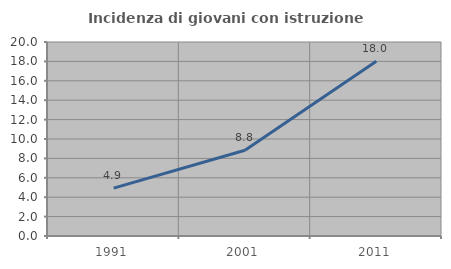
| Category | Incidenza di giovani con istruzione universitaria |
|---|---|
| 1991.0 | 4.932 |
| 2001.0 | 8.839 |
| 2011.0 | 18.007 |